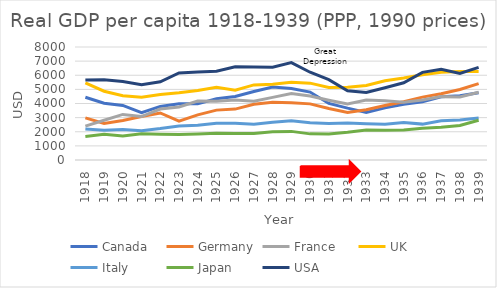
| Category | Canada | Germany | France | UK | Italy | Japan | USA |
|---|---|---|---|---|---|---|---|
| 1918.0 | 4440.595 | 2983.157 | 2395.529 | 5459.315 | 2190.668 | 1668.413 | 5658.984 |
| 1919.0 | 4019.343 | 2586.272 | 2811.375 | 4870.408 | 2102.738 | 1827.214 | 5680.406 |
| 1920.0 | 3861.476 | 2795.596 | 3226.921 | 4547.914 | 2152.784 | 1695.754 | 5552.327 |
| 1921.0 | 3357.01 | 3077.826 | 3074.626 | 4439.151 | 2079.5 | 1859.503 | 5322.734 |
| 1922.0 | 3793.146 | 3330.985 | 3610.392 | 4636.935 | 2231.232 | 1831.122 | 5539.844 |
| 1923.0 | 3975.958 | 2749.579 | 3753.526 | 4759.71 | 2413.777 | 1809.35 | 6164.199 |
| 1924.0 | 3977.019 | 3198.829 | 4179.464 | 4920.942 | 2456.98 | 1836.317 | 6232.551 |
| 1925.0 | 4340.276 | 3531.678 | 4166.378 | 5144.494 | 2602.341 | 1885.162 | 6282.419 |
| 1926.0 | 4497.057 | 3604.636 | 4249.469 | 4936.114 | 2600.228 | 1871.578 | 6602.442 |
| 1927.0 | 4846.996 | 3941.099 | 4153.971 | 5314.938 | 2530.703 | 1869.767 | 6576.499 |
| 1928.0 | 5171.589 | 4089.994 | 4431.465 | 5356.965 | 2666.2 | 1992.372 | 6569.345 |
| 1929.0 | 5065.446 | 4051.406 | 4709.998 | 5503.318 | 2777.99 | 2025.735 | 6898.722 |
| 1930.0 | 4810.605 | 3973.358 | 4531.558 | 5440.862 | 2630.982 | 1850.391 | 6212.713 |
| 1931.0 | 4003.693 | 3651.514 | 4235.26 | 5138.416 | 2578.905 | 1837.341 | 5691.367 |
| 1932.0 | 3671.453 | 3361.678 | 3959.123 | 5148.253 | 2615.175 | 1961.583 | 4908.366 |
| 1933.0 | 3370.406 | 3555.788 | 4239.126 | 5277.461 | 2565.061 | 2122.436 | 4776.915 |
| 1934.0 | 3691.03 | 3858.212 | 4191.731 | 5607.508 | 2538.053 | 2098.342 | 5113.608 |
| 1935.0 | 3950.625 | 4119.813 | 4085.931 | 5799.005 | 2654.108 | 2120.468 | 5466.838 |
| 1936.0 | 4124.206 | 4450.742 | 4243.998 | 6035.169 | 2540.304 | 2244.421 | 6203.884 |
| 1937.0 | 4473.41 | 4684.923 | 4486.637 | 6217.619 | 2772.274 | 2315.116 | 6430.121 |
| 1938.0 | 4545.91 | 4993.597 | 4466.211 | 6266.452 | 2830.122 | 2449.275 | 6126.466 |
| 1939.0 | 4768.131 | 5406.244 | 4793.311 | 6262.401 | 2980.825 | 2816.057 | 6560.753 |